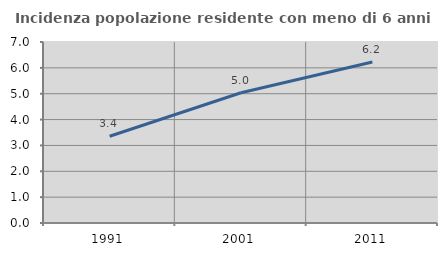
| Category | Incidenza popolazione residente con meno di 6 anni |
|---|---|
| 1991.0 | 3.356 |
| 2001.0 | 5.036 |
| 2011.0 | 6.226 |